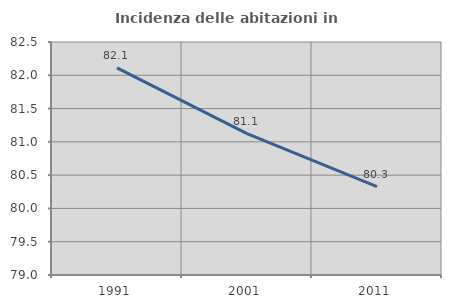
| Category | Incidenza delle abitazioni in proprietà  |
|---|---|
| 1991.0 | 82.11 |
| 2001.0 | 81.122 |
| 2011.0 | 80.328 |